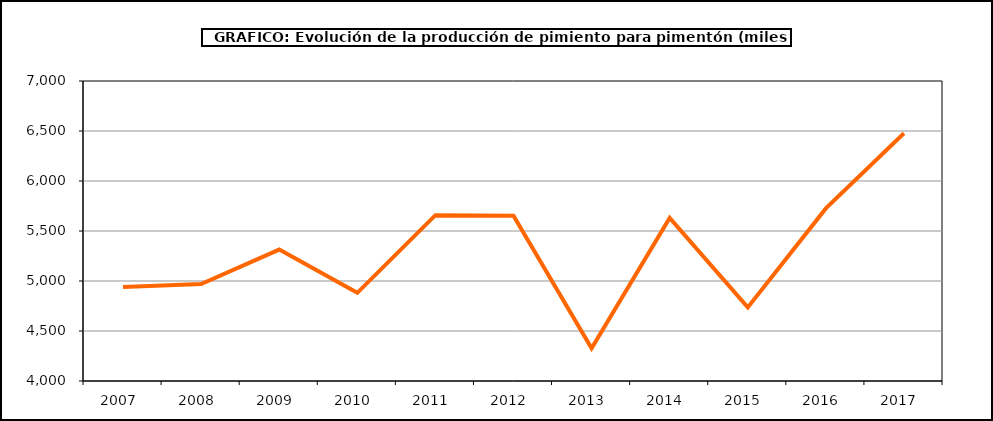
| Category | Producción |
|---|---|
| 2007.0 | 4939 |
| 2008.0 | 4969 |
| 2009.0 | 5314 |
| 2010.0 | 4882 |
| 2011.0 | 5658 |
| 2012.0 | 5652 |
| 2013.0 | 4327 |
| 2014.0 | 5630 |
| 2015.0 | 4736 |
| 2016.0 | 5726 |
| 2017.0 | 6478 |